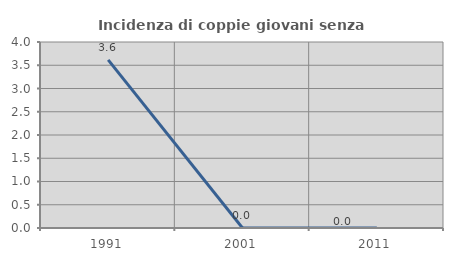
| Category | Incidenza di coppie giovani senza figli |
|---|---|
| 1991.0 | 3.614 |
| 2001.0 | 0 |
| 2011.0 | 0 |